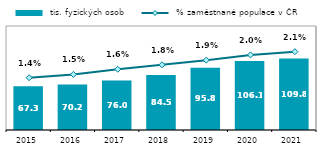
| Category |  tis. fyzických osob |
|---|---|
| 2015.0 | 67.304 |
| 2016.0 | 70.167 |
| 2017.0 | 75.994 |
| 2018.0 | 84.531 |
| 2019.0 | 95.752 |
| 2020.0 | 106.113 |
| 2021.0 | 109.817 |